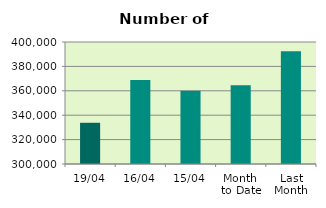
| Category | Series 0 |
|---|---|
| 19/04 | 333790 |
| 16/04 | 368820 |
| 15/04 | 360004 |
| Month 
to Date | 364576.6 |
| Last
Month | 392496.174 |